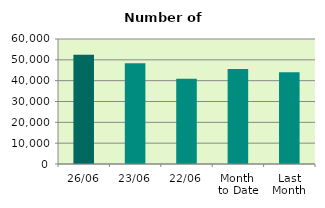
| Category | Series 0 |
|---|---|
| 26/06 | 52486 |
| 23/06 | 48334 |
| 22/06 | 40906 |
| Month 
to Date | 45575.778 |
| Last
Month | 44009.364 |